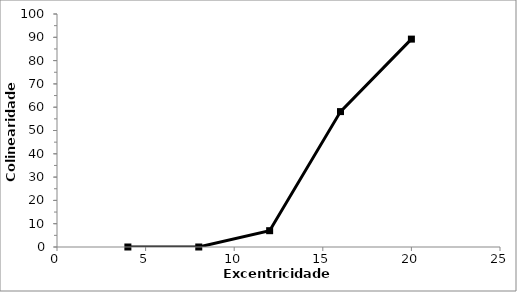
| Category | Series 1 |
|---|---|
| 4.0 | 0 |
| 8.0 | 0 |
| 12.0 | 7 |
| 16.0 | 58.111 |
| 20.0 | 89.222 |